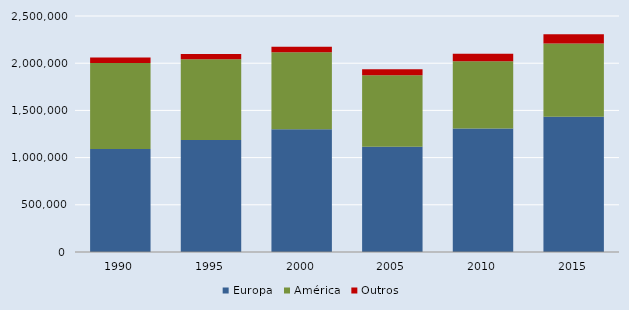
| Category | Europa | América | Outros |
|---|---|---|---|
| 1990.0 | 1092141 | 910907 | 57742 |
| 1995.0 | 1187356 | 853198 | 56635 |
| 2000.0 | 1301084 | 815315 | 58045 |
| 2005.0 | 1114618 | 758905 | 62543 |
| 2010.0 | 1308130 | 712886 | 77881 |
| 2015.0 | 1433482 | 775050 | 97789 |